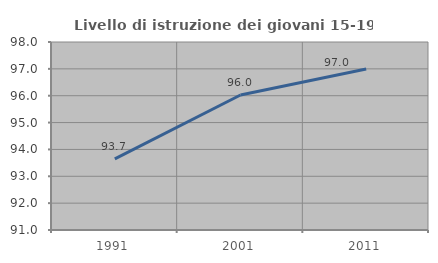
| Category | Livello di istruzione dei giovani 15-19 anni |
|---|---|
| 1991.0 | 93.651 |
| 2001.0 | 96.026 |
| 2011.0 | 96.992 |